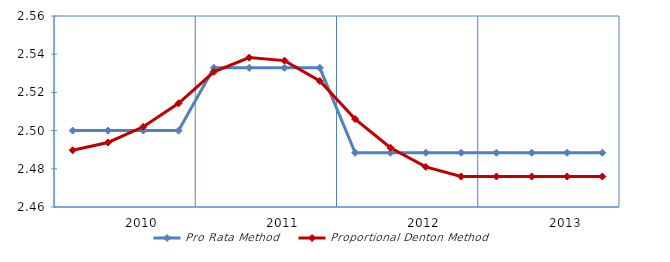
| Category | Pro Rata Method | Proportional Denton Method |
|---|---|---|
| nan | 2.5 | 2.49 |
| nan | 2.5 | 2.494 |
| 2010.0 | 2.5 | 2.502 |
| nan | 2.5 | 2.514 |
| nan | 2.533 | 2.531 |
| nan | 2.533 | 2.538 |
| 2011.0 | 2.533 | 2.537 |
| nan | 2.533 | 2.526 |
| nan | 2.488 | 2.506 |
| nan | 2.488 | 2.491 |
| 2012.0 | 2.488 | 2.481 |
| nan | 2.488 | 2.476 |
| nan | 2.488 | 2.476 |
| nan | 2.488 | 2.476 |
| 2013.0 | 2.488 | 2.476 |
| nan | 2.488 | 2.476 |